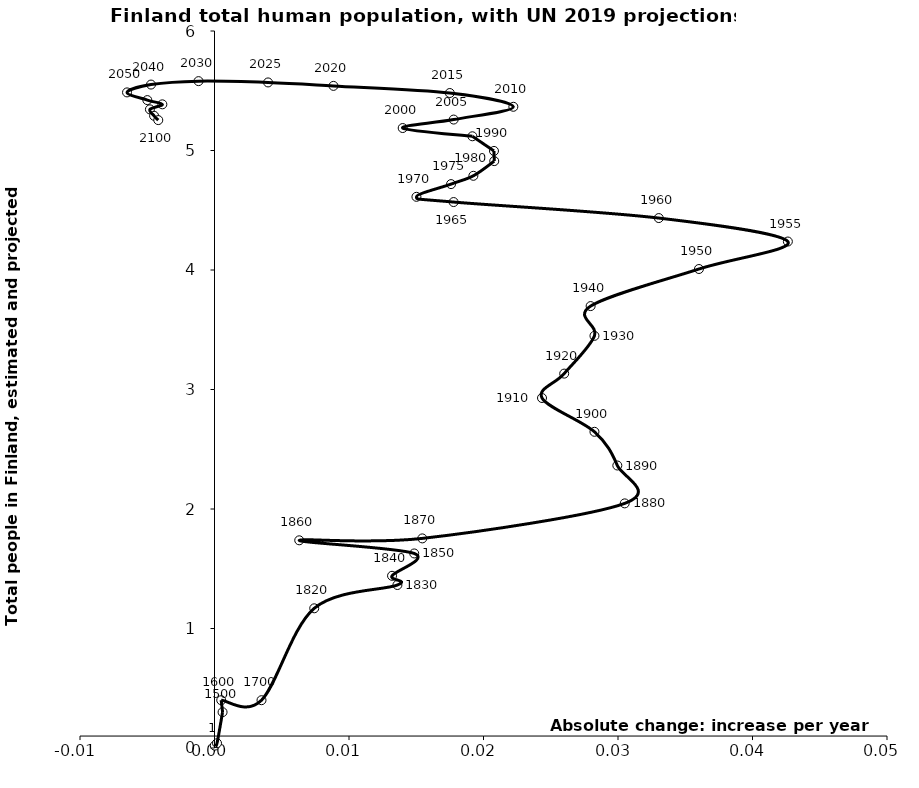
| Category | Series 0 |
|---|---|
| 2e-05 | 0.02 |
| 0.0001867911941294196 | 0.04 |
| 0.0006000000000000001 | 0.3 |
| 0.0005000000000000001 | 0.4 |
| 0.0034954545454545455 | 0.4 |
| 0.007415384615384616 | 1.169 |
| 0.013600000000000001 | 1.364 |
| 0.01319999999999999 | 1.441 |
| 0.014849999999999997 | 1.628 |
| 0.006300000000000005 | 1.738 |
| 0.015450000000000009 | 1.754 |
| 0.030499999999999992 | 2.047 |
| 0.029949999999999987 | 2.364 |
| 0.028249999999999997 | 2.646 |
| 0.024350000000000004 | 2.929 |
| 0.026000000000000002 | 3.133 |
| 0.028249999999999997 | 3.449 |
| 0.027964699999999933 | 3.698 |
| 0.036018333333333326 | 4.008 |
| 0.042629600000000066 | 4.238 |
| 0.0330322999999999 | 4.435 |
| 0.017777600000000237 | 4.569 |
| 0.015015100000000193 | 4.612 |
| 0.017587699999999807 | 4.719 |
| 0.01924709999999994 | 4.788 |
| 0.020797900000000258 | 4.911 |
| 0.020778500000000123 | 4.996 |
| 0.019173199999999824 | 5.119 |
| 0.013992199999999944 | 5.188 |
| 0.01778279999999972 | 5.259 |
| 0.022219500000000104 | 5.366 |
| 0.01749380000000018 | 5.481 |
| 0.008844999999999636 | 5.541 |
| 0.003981699999999933 | 5.57 |
| -0.0011870666666663847 | 5.581 |
| -0.004719700000000016 | 5.552 |
| -0.006502100000000066 | 5.486 |
| -0.004993849999999878 | 5.422 |
| -0.0038768000000001025 | 5.386 |
| -0.004801399999999978 | 5.344 |
| -0.004491099999999771 | 5.29 |
| -0.004180799999999563 | 5.254 |